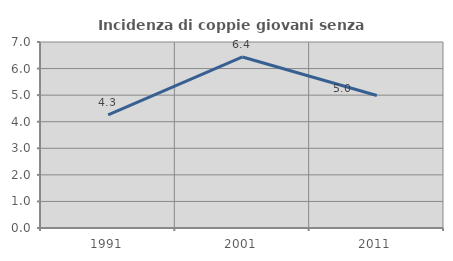
| Category | Incidenza di coppie giovani senza figli |
|---|---|
| 1991.0 | 4.259 |
| 2001.0 | 6.436 |
| 2011.0 | 4.987 |